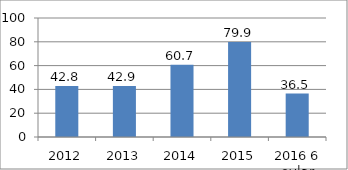
| Category | Series 0 |
|---|---|
| 2012 | 42.8 |
| 2013 | 42.9 |
| 2014 | 60.7 |
| 2015 | 79.9 |
| 2016 6 oylar | 36.5 |